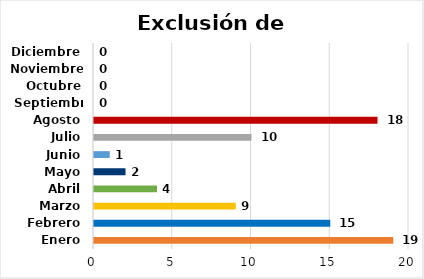
| Category | Exclusión de Firmas |
|---|---|
| Enero | 19 |
| Febrero | 15 |
| Marzo | 9 |
| Abril | 4 |
| Mayo | 2 |
| Junio | 1 |
| Julio | 10 |
| Agosto | 18 |
| Septiembre | 0 |
| Octubre | 0 |
| Noviembre | 0 |
| Diciembre | 0 |